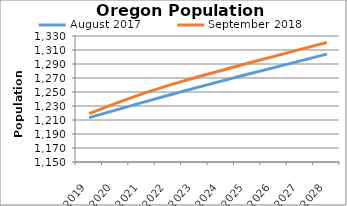
| Category | August 2017 | September 2018 |
|---|---|---|
| 2019.0 | 1213.44 | 1219.019 |
| 2020.0 | 1224.129 | 1233.755 |
| 2021.0 | 1234.853 | 1247.373 |
| 2022.0 | 1245.339 | 1259.52 |
| 2023.0 | 1255.53 | 1270.321 |
| 2024.0 | 1265.491 | 1280.732 |
| 2025.0 | 1275.267 | 1290.97 |
| 2026.0 | 1284.81 | 1300.937 |
| 2027.0 | 1294.432 | 1310.878 |
| 2028.0 | 1304.103 | 1320.779 |